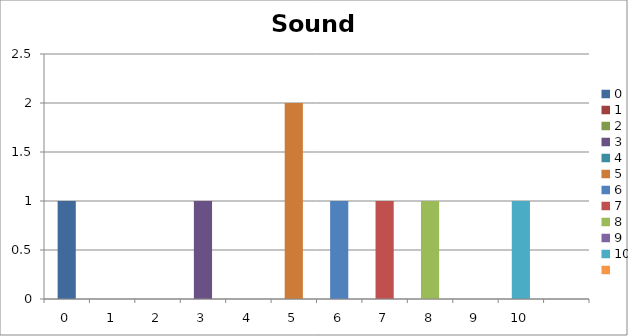
| Category | Sound Around |
|---|---|
| 0.0 | 1 |
| 1.0 | 0 |
| 2.0 | 0 |
| 3.0 | 1 |
| 4.0 | 0 |
| 5.0 | 2 |
| 6.0 | 1 |
| 7.0 | 1 |
| 8.0 | 1 |
| 9.0 | 0 |
| 10.0 | 1 |